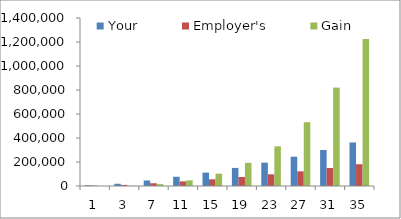
| Category | Your | Employer's | Gain |
|---|---|---|---|
| 1.0 | 6000 | 3000 | 0 |
| 3.0 | 18545.4 | 9272.7 | 1953 |
| 7.0 | 45974.773 | 22987.387 | 15617.053 |
| 11.0 | 76846.774 | 38423.387 | 46868.907 |
| 15.0 | 111593.483 | 55796.742 | 102849.203 |
| 19.0 | 150701.211 | 75350.605 | 193128.018 |
| 23.0 | 194717.302 | 97358.651 | 330486.301 |
| 27.0 | 244257.801 | 122128.901 | 531943.489 |
| 31.0 | 300016.069 | 150008.035 | 820108.22 |
| 35.0 | 362772.491 | 181386.245 | 1224953.045 |